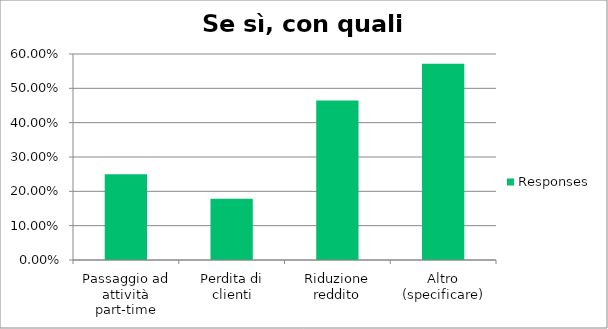
| Category | Responses |
|---|---|
| Passaggio ad attività part-time | 0.25 |
| Perdita di clienti | 0.179 |
| Riduzione reddito | 0.464 |
| Altro (specificare) | 0.571 |